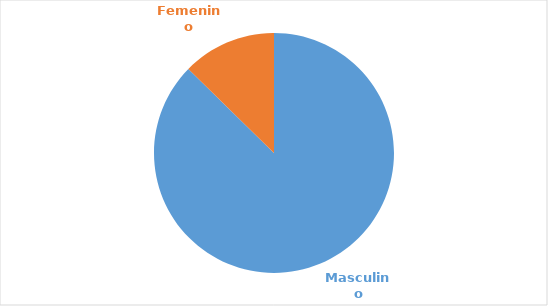
| Category | Series 0 |
|---|---|
| Masculino | 0.873 |
| Femenino | 0.127 |